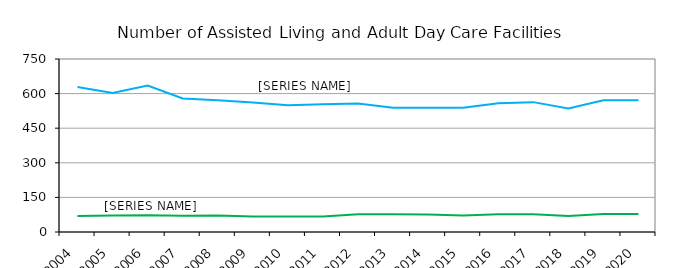
| Category | Assisted Living | Adult Day Care |
|---|---|---|
| 2004.0 | 629 | 69 |
| 2005.0 | 603 | 71 |
| 2006.0 | 635 | 73 |
| 2007.0 | 579 | 70 |
| 2008.0 | 571 | 72 |
| 2009.0 | 561 | 67 |
| 2010.0 | 549 | 67 |
| 2011.0 | 554 | 67 |
| 2012.0 | 557 | 77 |
| 2013.0 | 539 | 77 |
| 2014.0 | 539 | 76 |
| 2015.0 | 539 | 72 |
| 2016.0 | 558 | 77 |
| 2017.0 | 563 | 77 |
| 2018.0 | 536 | 69 |
| 2019.0 | 571 | 78 |
| 2020.0 | 571 | 78 |